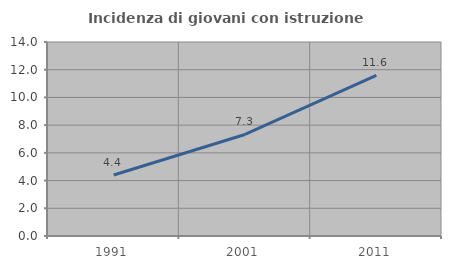
| Category | Incidenza di giovani con istruzione universitaria |
|---|---|
| 1991.0 | 4.405 |
| 2001.0 | 7.328 |
| 2011.0 | 11.585 |